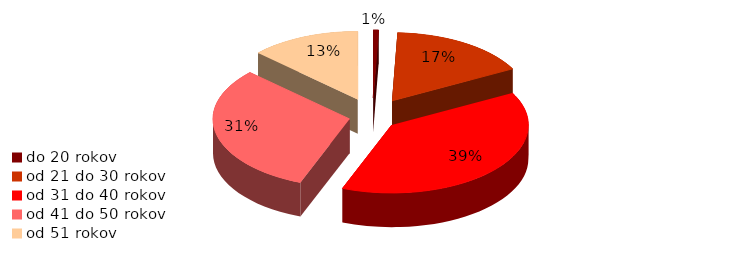
| Category | Series 0 |
|---|---|
| do 20 rokov | 0.006 |
| od 21 do 30 rokov | 0.166 |
| od 31 do 40 rokov | 0.387 |
| od 41 do 50 rokov | 0.311 |
| od 51 rokov | 0.13 |